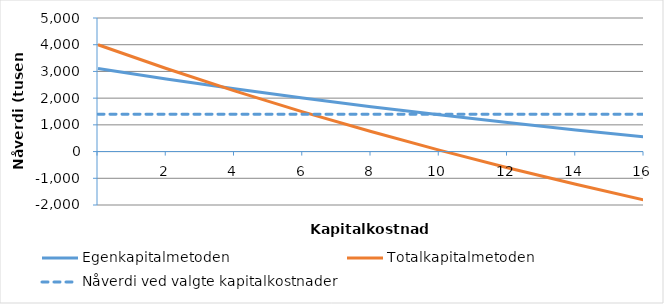
| Category | Egenkapitalmetoden | Totalkapitalmetoden | Nåverdi ved valgte kapitalkostnader |
|---|---|---|---|
| nan | 3109 | 4000 | 1400 |
| 2.0 | 2719.088 | 3109.136 | 1400 |
| 4.0 | 2352.512 | 2273.27 | 1400 |
| 6.0 | 2007.387 | 1487.873 | 1400 |
| 8.0 | 1682.016 | 748.87 | 1400 |
| 10.0 | 1374.869 | 52.592 | 1400 |
| 12.0 | 1084.559 | -604.273 | 1400 |
| 14.0 | 809.835 | -1224.722 | 1400 |
| 16.0 | 549.556 | -1811.472 | 1400 |